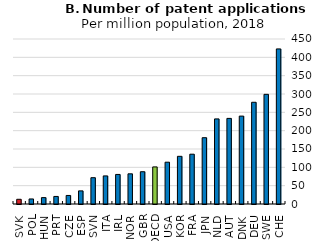
| Category | 2018 |
|---|---|
| SVK | 12.845 |
| POL | 13.741 |
| HUN | 17.406 |
| PRT | 20.612 |
| CZE | 23.305 |
| ESP | 35.759 |
| SVN | 71.755 |
| ITA | 76.595 |
| IRL | 80.6 |
| NOR | 82.303 |
| GBR | 88.018 |
| OECD | 101.123 |
| USA | 114 |
| KOR | 130.036 |
| FRA | 135.849 |
| JPN | 180.803 |
| NLD | 232.073 |
| AUT | 233.473 |
| DNK | 239.723 |
| DEU | 277.456 |
| SWE | 299.089 |
| CHE | 422.957 |